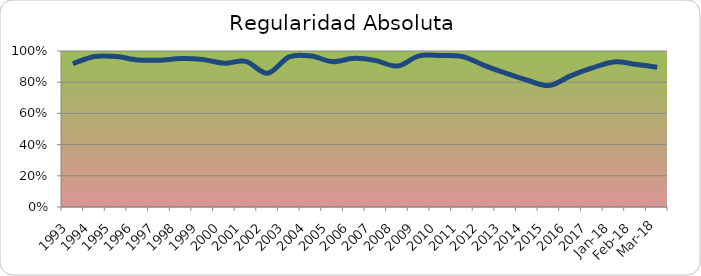
| Category | Series 0 |
|---|---|
| 1993.0 | 0.918 |
| 1994.0 | 0.965 |
| 1995.0 | 0.965 |
| 1996.0 | 0.943 |
| 1997.0 | 0.941 |
| 1998.0 | 0.951 |
| 1999.0 | 0.946 |
| 2000.0 | 0.922 |
| 2001.0 | 0.933 |
| 2002.0 | 0.858 |
| 2003.0 | 0.962 |
| 2004.0 | 0.968 |
| 2005.0 | 0.932 |
| 2006.0 | 0.953 |
| 2007.0 | 0.938 |
| 2008.0 | 0.903 |
| 2009.0 | 0.968 |
| 2010.0 | 0.971 |
| 2011.0 | 0.965 |
| 2012.0 | 0.908 |
| 2013.0 | 0.857 |
| 2014.0 | 0.812 |
| 2015.0 | 0.779 |
| 2016.0 | 0.84 |
| 2017.0 | 0.891 |
| 43101.0 | 0.93 |
| 43132.0 | 0.915 |
| 43160.0 | 0.896 |